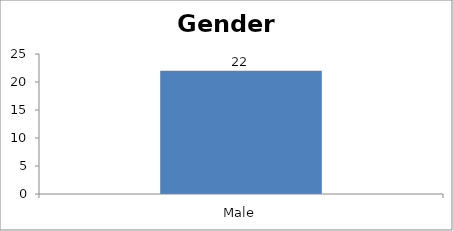
| Category | Gender |
|---|---|
| Male | 22 |